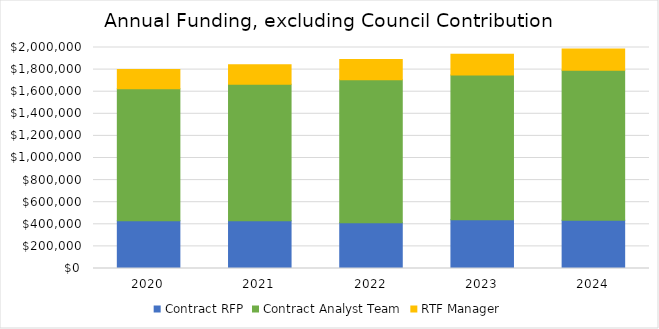
| Category | Contract RFP | Contract Analyst Team | RTF Manager |
|---|---|---|---|
| 2020.0 | 433000 | 1193000 | 174000 |
| 2021.0 | 431400 | 1235200 | 178400 |
| 2022.0 | 412900 | 1295400 | 182800 |
| 2023.0 | 440400 | 1310600 | 187400 |
| 2024.0 | 436000 | 1358700 | 192100 |